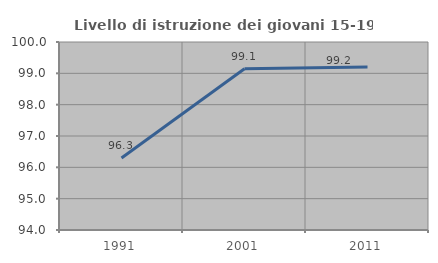
| Category | Livello di istruzione dei giovani 15-19 anni |
|---|---|
| 1991.0 | 96.296 |
| 2001.0 | 99.145 |
| 2011.0 | 99.2 |